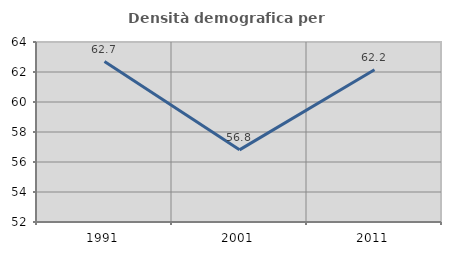
| Category | Densità demografica |
|---|---|
| 1991.0 | 62.693 |
| 2001.0 | 56.81 |
| 2011.0 | 62.151 |